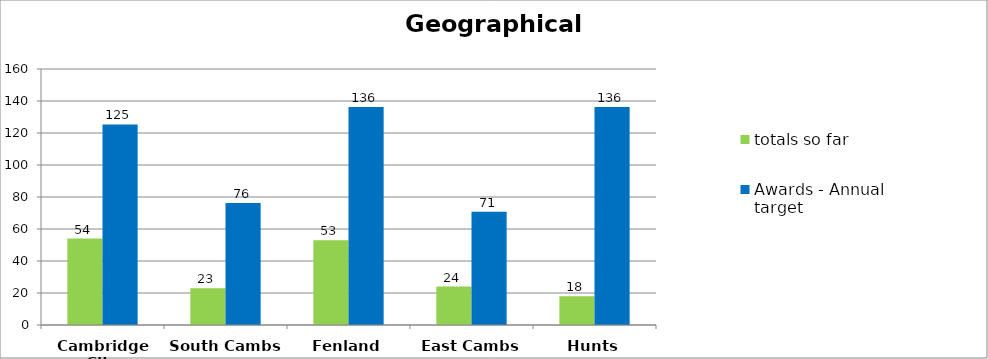
| Category | totals so far | Awards - Annual target  |
|---|---|---|
| Cambridge City | 54 | 125.354 |
| South Cambs | 23 | 76.302 |
| Fenland | 53 | 136.254 |
| East Cambs | 24 | 70.852 |
| Hunts | 18 | 136.254 |